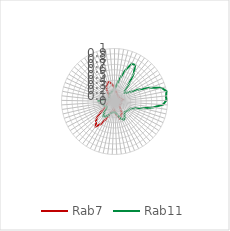
| Category | Rab7 | Rab11 |
|---|---|---|
| 0.0 | 0.262 | 0.224 |
| 0.10913 | 0.205 | 0.275 |
| 0.21825 | 0.185 | 0.368 |
| 0.32738 | 0.161 | 0.489 |
| 0.43651 | 0.151 | 0.643 |
| 0.54563 | 0.136 | 0.783 |
| 0.65476 | 0.133 | 0.79 |
| 0.76389 | 0.114 | 0.641 |
| 0.87302 | 0.104 | 0.426 |
| 0.98214 | 0.12 | 0.278 |
| 1.09127 | 0.116 | 0.247 |
| 1.2004 | 0.101 | 0.274 |
| 1.30952 | 0.106 | 0.361 |
| 1.41865 | 0.129 | 0.525 |
| 1.52778 | 0.145 | 0.731 |
| 1.6369 | 0.125 | 0.929 |
| 1.74603 | 0.165 | 1 |
| 1.85516 | 0.139 | 0.977 |
| 1.96429 | 0.118 | 0.978 |
| 2.07341 | 0.108 | 0.918 |
| 2.18254 | 0.105 | 0.742 |
| 2.29167 | 0.126 | 0.547 |
| 2.40079 | 0.14 | 0.408 |
| 2.50992 | 0.116 | 0.332 |
| 2.61905 | 0.115 | 0.317 |
| 2.72817 | 0.127 | 0.307 |
| 2.8373 | 0.115 | 0.295 |
| 2.94643 | 0.13 | 0.278 |
| 3.05556 | 0.133 | 0.283 |
| 3.16468 | 0.189 | 0.311 |
| 3.27381 | 0.259 | 0.361 |
| 3.38294 | 0.279 | 0.384 |
| 3.49206 | 0.302 | 0.359 |
| 3.60119 | 0.331 | 0.308 |
| 3.71032 | 0.273 | 0.253 |
| 3.81944 | 0.25 | 0.225 |
| 3.92857 | 0.191 | 0.205 |
| 4.0377 | 0.174 | 0.211 |
| 4.14683 | 0.136 | 0.202 |
| 4.25595 | 0.187 | 0.214 |
| 4.36508 | 0.212 | 0.235 |
| 4.47421 | 0.283 | 0.256 |
| 4.58333 | 0.394 | 0.308 |
| 4.69246 | 0.512 | 0.333 |
| 4.80159 | 0.589 | 0.347 |
| 4.91071 | 0.521 | 0.3 |
| 5.01984 | 0.463 | 0.234 |
| 5.12897 | 0.336 | 0.189 |
| 5.2381 | 0.232 | 0.171 |
| 5.34722 | 0.196 | 0.176 |
| 5.45635 | 0.174 | 0.203 |
| 5.56548 | 0.138 | 0.222 |
| 5.6746 | 0.138 | 0.218 |
| 5.78373 | 0.132 | 0.241 |
| 5.89286 | 0.107 | 0.29 |
| 6.00198 | 0.088 | 0.303 |
| 6.11111 | 0.078 | 0.252 |
| 6.22024 | 0.07 | 0.17 |
| 6.32937 | 0.085 | 0.119 |
| 6.43849 | 0.093 | 0.111 |
| 6.54762 | 0.084 | 0.1 |
| 6.65675 | 0.074 | 0.106 |
| 6.76587 | 0.109 | 0.124 |
| 6.875 | 0.151 | 0.129 |
| 6.98413 | 0.16 | 0.122 |
| 7.09325 | 0.169 | 0.135 |
| 7.20238 | 0.248 | 0.149 |
| 7.31151 | 0.314 | 0.18 |
| 7.42063 | 0.34 | 0.173 |
| 7.52976 | 0.382 | 0.177 |
| 7.63889 | 0.38 | 0.194 |
| 7.74802 | 0.342 | 0.207 |
| 7.85714 | 0.3 | 0.224 |